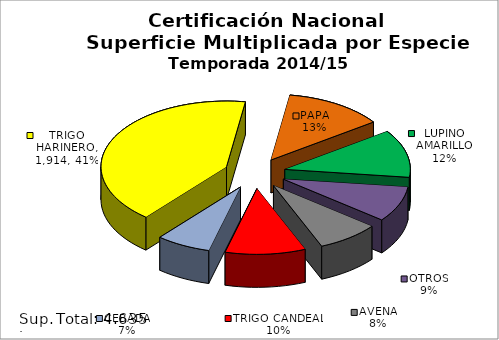
| Category | Series 0 |
|---|---|
| TRIGO HARINERO | 1914 |
| PAPA | 592.7 |
| LUPINO AMARILLO | 544 |
| OTROS | 404 |
| AVENA | 374 |
| TRIGO CANDEAL | 480 |
| CEBADA | 326 |